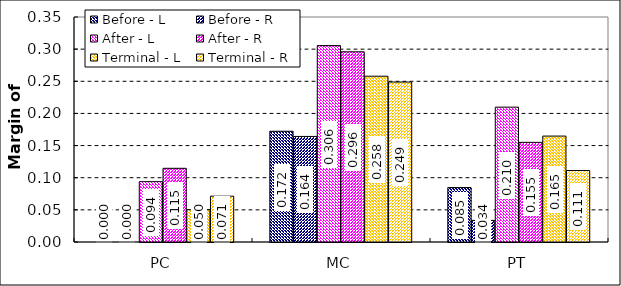
| Category | Before - L | Before - R | After - L | After - R | Terminal - L | Terminal - R |
|---|---|---|---|---|---|---|
| PC | 0 | 0 | 0.094 | 0.115 | 0.05 | 0.071 |
| MC | 0.172 | 0.164 | 0.306 | 0.296 | 0.258 | 0.249 |
| PT | 0.085 | 0.034 | 0.21 | 0.155 | 0.165 | 0.111 |